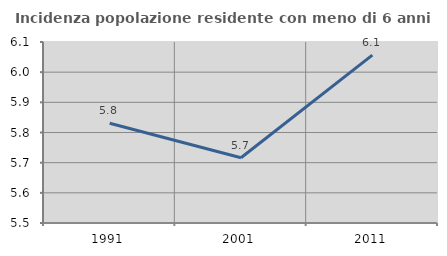
| Category | Incidenza popolazione residente con meno di 6 anni |
|---|---|
| 1991.0 | 5.831 |
| 2001.0 | 5.716 |
| 2011.0 | 6.057 |